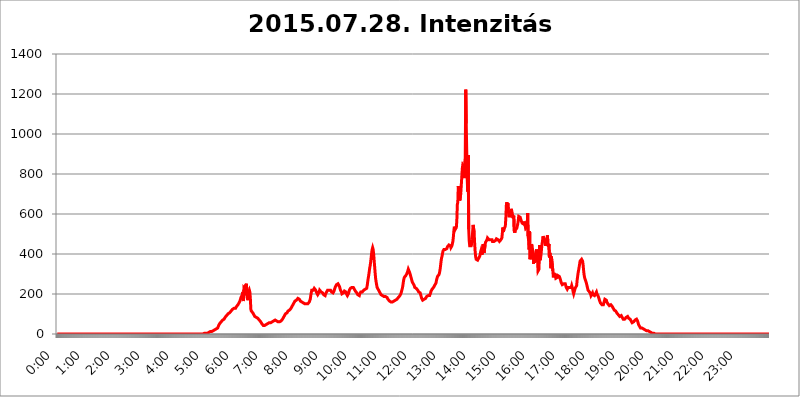
| Category | 2015.07.28. Intenzitás [W/m^2] |
|---|---|
| 0.0 | 0 |
| 0.0006944444444444445 | 0 |
| 0.001388888888888889 | 0 |
| 0.0020833333333333333 | 0 |
| 0.002777777777777778 | 0 |
| 0.003472222222222222 | 0 |
| 0.004166666666666667 | 0 |
| 0.004861111111111111 | 0 |
| 0.005555555555555556 | 0 |
| 0.0062499999999999995 | 0 |
| 0.006944444444444444 | 0 |
| 0.007638888888888889 | 0 |
| 0.008333333333333333 | 0 |
| 0.009027777777777779 | 0 |
| 0.009722222222222222 | 0 |
| 0.010416666666666666 | 0 |
| 0.011111111111111112 | 0 |
| 0.011805555555555555 | 0 |
| 0.012499999999999999 | 0 |
| 0.013194444444444444 | 0 |
| 0.013888888888888888 | 0 |
| 0.014583333333333332 | 0 |
| 0.015277777777777777 | 0 |
| 0.015972222222222224 | 0 |
| 0.016666666666666666 | 0 |
| 0.017361111111111112 | 0 |
| 0.018055555555555557 | 0 |
| 0.01875 | 0 |
| 0.019444444444444445 | 0 |
| 0.02013888888888889 | 0 |
| 0.020833333333333332 | 0 |
| 0.02152777777777778 | 0 |
| 0.022222222222222223 | 0 |
| 0.02291666666666667 | 0 |
| 0.02361111111111111 | 0 |
| 0.024305555555555556 | 0 |
| 0.024999999999999998 | 0 |
| 0.025694444444444447 | 0 |
| 0.02638888888888889 | 0 |
| 0.027083333333333334 | 0 |
| 0.027777777777777776 | 0 |
| 0.02847222222222222 | 0 |
| 0.029166666666666664 | 0 |
| 0.029861111111111113 | 0 |
| 0.030555555555555555 | 0 |
| 0.03125 | 0 |
| 0.03194444444444445 | 0 |
| 0.03263888888888889 | 0 |
| 0.03333333333333333 | 0 |
| 0.034027777777777775 | 0 |
| 0.034722222222222224 | 0 |
| 0.035416666666666666 | 0 |
| 0.036111111111111115 | 0 |
| 0.03680555555555556 | 0 |
| 0.0375 | 0 |
| 0.03819444444444444 | 0 |
| 0.03888888888888889 | 0 |
| 0.03958333333333333 | 0 |
| 0.04027777777777778 | 0 |
| 0.04097222222222222 | 0 |
| 0.041666666666666664 | 0 |
| 0.042361111111111106 | 0 |
| 0.04305555555555556 | 0 |
| 0.043750000000000004 | 0 |
| 0.044444444444444446 | 0 |
| 0.04513888888888889 | 0 |
| 0.04583333333333334 | 0 |
| 0.04652777777777778 | 0 |
| 0.04722222222222222 | 0 |
| 0.04791666666666666 | 0 |
| 0.04861111111111111 | 0 |
| 0.049305555555555554 | 0 |
| 0.049999999999999996 | 0 |
| 0.05069444444444445 | 0 |
| 0.051388888888888894 | 0 |
| 0.052083333333333336 | 0 |
| 0.05277777777777778 | 0 |
| 0.05347222222222222 | 0 |
| 0.05416666666666667 | 0 |
| 0.05486111111111111 | 0 |
| 0.05555555555555555 | 0 |
| 0.05625 | 0 |
| 0.05694444444444444 | 0 |
| 0.057638888888888885 | 0 |
| 0.05833333333333333 | 0 |
| 0.05902777777777778 | 0 |
| 0.059722222222222225 | 0 |
| 0.06041666666666667 | 0 |
| 0.061111111111111116 | 0 |
| 0.06180555555555556 | 0 |
| 0.0625 | 0 |
| 0.06319444444444444 | 0 |
| 0.06388888888888888 | 0 |
| 0.06458333333333334 | 0 |
| 0.06527777777777778 | 0 |
| 0.06597222222222222 | 0 |
| 0.06666666666666667 | 0 |
| 0.06736111111111111 | 0 |
| 0.06805555555555555 | 0 |
| 0.06874999999999999 | 0 |
| 0.06944444444444443 | 0 |
| 0.07013888888888889 | 0 |
| 0.07083333333333333 | 0 |
| 0.07152777777777779 | 0 |
| 0.07222222222222223 | 0 |
| 0.07291666666666667 | 0 |
| 0.07361111111111111 | 0 |
| 0.07430555555555556 | 0 |
| 0.075 | 0 |
| 0.07569444444444444 | 0 |
| 0.0763888888888889 | 0 |
| 0.07708333333333334 | 0 |
| 0.07777777777777778 | 0 |
| 0.07847222222222222 | 0 |
| 0.07916666666666666 | 0 |
| 0.0798611111111111 | 0 |
| 0.08055555555555556 | 0 |
| 0.08125 | 0 |
| 0.08194444444444444 | 0 |
| 0.08263888888888889 | 0 |
| 0.08333333333333333 | 0 |
| 0.08402777777777777 | 0 |
| 0.08472222222222221 | 0 |
| 0.08541666666666665 | 0 |
| 0.08611111111111112 | 0 |
| 0.08680555555555557 | 0 |
| 0.08750000000000001 | 0 |
| 0.08819444444444445 | 0 |
| 0.08888888888888889 | 0 |
| 0.08958333333333333 | 0 |
| 0.09027777777777778 | 0 |
| 0.09097222222222222 | 0 |
| 0.09166666666666667 | 0 |
| 0.09236111111111112 | 0 |
| 0.09305555555555556 | 0 |
| 0.09375 | 0 |
| 0.09444444444444444 | 0 |
| 0.09513888888888888 | 0 |
| 0.09583333333333333 | 0 |
| 0.09652777777777777 | 0 |
| 0.09722222222222222 | 0 |
| 0.09791666666666667 | 0 |
| 0.09861111111111111 | 0 |
| 0.09930555555555555 | 0 |
| 0.09999999999999999 | 0 |
| 0.10069444444444443 | 0 |
| 0.1013888888888889 | 0 |
| 0.10208333333333335 | 0 |
| 0.10277777777777779 | 0 |
| 0.10347222222222223 | 0 |
| 0.10416666666666667 | 0 |
| 0.10486111111111111 | 0 |
| 0.10555555555555556 | 0 |
| 0.10625 | 0 |
| 0.10694444444444444 | 0 |
| 0.1076388888888889 | 0 |
| 0.10833333333333334 | 0 |
| 0.10902777777777778 | 0 |
| 0.10972222222222222 | 0 |
| 0.1111111111111111 | 0 |
| 0.11180555555555556 | 0 |
| 0.11180555555555556 | 0 |
| 0.1125 | 0 |
| 0.11319444444444444 | 0 |
| 0.11388888888888889 | 0 |
| 0.11458333333333333 | 0 |
| 0.11527777777777777 | 0 |
| 0.11597222222222221 | 0 |
| 0.11666666666666665 | 0 |
| 0.1173611111111111 | 0 |
| 0.11805555555555557 | 0 |
| 0.11944444444444445 | 0 |
| 0.12013888888888889 | 0 |
| 0.12083333333333333 | 0 |
| 0.12152777777777778 | 0 |
| 0.12222222222222223 | 0 |
| 0.12291666666666667 | 0 |
| 0.12291666666666667 | 0 |
| 0.12361111111111112 | 0 |
| 0.12430555555555556 | 0 |
| 0.125 | 0 |
| 0.12569444444444444 | 0 |
| 0.12638888888888888 | 0 |
| 0.12708333333333333 | 0 |
| 0.16875 | 0 |
| 0.12847222222222224 | 0 |
| 0.12916666666666668 | 0 |
| 0.12986111111111112 | 0 |
| 0.13055555555555556 | 0 |
| 0.13125 | 0 |
| 0.13194444444444445 | 0 |
| 0.1326388888888889 | 0 |
| 0.13333333333333333 | 0 |
| 0.13402777777777777 | 0 |
| 0.13402777777777777 | 0 |
| 0.13472222222222222 | 0 |
| 0.13541666666666666 | 0 |
| 0.1361111111111111 | 0 |
| 0.13749999999999998 | 0 |
| 0.13819444444444443 | 0 |
| 0.1388888888888889 | 0 |
| 0.13958333333333334 | 0 |
| 0.14027777777777778 | 0 |
| 0.14097222222222222 | 0 |
| 0.14166666666666666 | 0 |
| 0.1423611111111111 | 0 |
| 0.14305555555555557 | 0 |
| 0.14375000000000002 | 0 |
| 0.14444444444444446 | 0 |
| 0.1451388888888889 | 0 |
| 0.1451388888888889 | 0 |
| 0.14652777777777778 | 0 |
| 0.14722222222222223 | 0 |
| 0.14791666666666667 | 0 |
| 0.1486111111111111 | 0 |
| 0.14930555555555555 | 0 |
| 0.15 | 0 |
| 0.15069444444444444 | 0 |
| 0.15138888888888888 | 0 |
| 0.15208333333333332 | 0 |
| 0.15277777777777776 | 0 |
| 0.15347222222222223 | 0 |
| 0.15416666666666667 | 0 |
| 0.15486111111111112 | 0 |
| 0.15555555555555556 | 0 |
| 0.15625 | 0 |
| 0.15694444444444444 | 0 |
| 0.15763888888888888 | 0 |
| 0.15833333333333333 | 0 |
| 0.15902777777777777 | 0 |
| 0.15972222222222224 | 0 |
| 0.16041666666666668 | 0 |
| 0.16111111111111112 | 0 |
| 0.16180555555555556 | 0 |
| 0.1625 | 0 |
| 0.16319444444444445 | 0 |
| 0.1638888888888889 | 0 |
| 0.16458333333333333 | 0 |
| 0.16527777777777777 | 0 |
| 0.16597222222222222 | 0 |
| 0.16666666666666666 | 0 |
| 0.1673611111111111 | 0 |
| 0.16805555555555554 | 0 |
| 0.16874999999999998 | 0 |
| 0.16944444444444443 | 0 |
| 0.17013888888888887 | 0 |
| 0.1708333333333333 | 0 |
| 0.17152777777777775 | 0 |
| 0.17222222222222225 | 0 |
| 0.1729166666666667 | 0 |
| 0.17361111111111113 | 0 |
| 0.17430555555555557 | 0 |
| 0.17500000000000002 | 0 |
| 0.17569444444444446 | 0 |
| 0.1763888888888889 | 0 |
| 0.17708333333333334 | 0 |
| 0.17777777777777778 | 0 |
| 0.17847222222222223 | 0 |
| 0.17916666666666667 | 0 |
| 0.1798611111111111 | 0 |
| 0.18055555555555555 | 0 |
| 0.18125 | 0 |
| 0.18194444444444444 | 0 |
| 0.1826388888888889 | 0 |
| 0.18333333333333335 | 0 |
| 0.1840277777777778 | 0 |
| 0.18472222222222223 | 0 |
| 0.18541666666666667 | 0 |
| 0.18611111111111112 | 0 |
| 0.18680555555555556 | 0 |
| 0.1875 | 0 |
| 0.18819444444444444 | 0 |
| 0.18888888888888888 | 0 |
| 0.18958333333333333 | 0 |
| 0.19027777777777777 | 0 |
| 0.1909722222222222 | 0 |
| 0.19166666666666665 | 0 |
| 0.19236111111111112 | 0 |
| 0.19305555555555554 | 0 |
| 0.19375 | 0 |
| 0.19444444444444445 | 0 |
| 0.1951388888888889 | 0 |
| 0.19583333333333333 | 0 |
| 0.19652777777777777 | 0 |
| 0.19722222222222222 | 0 |
| 0.19791666666666666 | 0 |
| 0.1986111111111111 | 0 |
| 0.19930555555555554 | 0 |
| 0.19999999999999998 | 0 |
| 0.20069444444444443 | 0 |
| 0.20138888888888887 | 0 |
| 0.2020833333333333 | 0 |
| 0.2027777777777778 | 0 |
| 0.2034722222222222 | 0 |
| 0.2041666666666667 | 0 |
| 0.20486111111111113 | 0 |
| 0.20555555555555557 | 0 |
| 0.20625000000000002 | 3.525 |
| 0.20694444444444446 | 3.525 |
| 0.2076388888888889 | 3.525 |
| 0.20833333333333334 | 3.525 |
| 0.20902777777777778 | 3.525 |
| 0.20972222222222223 | 3.525 |
| 0.21041666666666667 | 3.525 |
| 0.2111111111111111 | 7.887 |
| 0.21180555555555555 | 7.887 |
| 0.2125 | 7.887 |
| 0.21319444444444444 | 7.887 |
| 0.2138888888888889 | 7.887 |
| 0.21458333333333335 | 12.257 |
| 0.2152777777777778 | 12.257 |
| 0.21597222222222223 | 12.257 |
| 0.21666666666666667 | 12.257 |
| 0.21736111111111112 | 16.636 |
| 0.21805555555555556 | 16.636 |
| 0.21875 | 16.636 |
| 0.21944444444444444 | 21.024 |
| 0.22013888888888888 | 21.024 |
| 0.22083333333333333 | 21.024 |
| 0.22152777777777777 | 25.419 |
| 0.2222222222222222 | 25.419 |
| 0.22291666666666665 | 25.419 |
| 0.2236111111111111 | 29.823 |
| 0.22430555555555556 | 29.823 |
| 0.225 | 29.823 |
| 0.22569444444444445 | 34.234 |
| 0.2263888888888889 | 43.079 |
| 0.22708333333333333 | 47.511 |
| 0.22777777777777777 | 51.951 |
| 0.22847222222222222 | 51.951 |
| 0.22916666666666666 | 56.398 |
| 0.2298611111111111 | 60.85 |
| 0.23055555555555554 | 60.85 |
| 0.23124999999999998 | 65.31 |
| 0.23194444444444443 | 69.775 |
| 0.23263888888888887 | 69.775 |
| 0.2333333333333333 | 74.246 |
| 0.2340277777777778 | 74.246 |
| 0.2347222222222222 | 78.722 |
| 0.2354166666666667 | 83.205 |
| 0.23611111111111113 | 83.205 |
| 0.23680555555555557 | 87.692 |
| 0.23750000000000002 | 92.184 |
| 0.23819444444444446 | 92.184 |
| 0.2388888888888889 | 96.682 |
| 0.23958333333333334 | 101.184 |
| 0.24027777777777778 | 101.184 |
| 0.24097222222222223 | 105.69 |
| 0.24166666666666667 | 105.69 |
| 0.2423611111111111 | 110.201 |
| 0.24305555555555555 | 110.201 |
| 0.24375 | 114.716 |
| 0.24444444444444446 | 119.235 |
| 0.24513888888888888 | 119.235 |
| 0.24583333333333335 | 123.758 |
| 0.2465277777777778 | 123.758 |
| 0.24722222222222223 | 123.758 |
| 0.24791666666666667 | 128.284 |
| 0.24861111111111112 | 128.284 |
| 0.24930555555555556 | 128.284 |
| 0.25 | 128.284 |
| 0.25069444444444444 | 132.814 |
| 0.2513888888888889 | 137.347 |
| 0.2520833333333333 | 137.347 |
| 0.25277777777777777 | 141.884 |
| 0.2534722222222222 | 146.423 |
| 0.25416666666666665 | 150.964 |
| 0.2548611111111111 | 155.509 |
| 0.2555555555555556 | 160.056 |
| 0.25625000000000003 | 164.605 |
| 0.2569444444444445 | 173.709 |
| 0.2576388888888889 | 182.82 |
| 0.25833333333333336 | 187.378 |
| 0.2590277777777778 | 191.937 |
| 0.25972222222222224 | 201.058 |
| 0.2604166666666667 | 210.182 |
| 0.2611111111111111 | 164.605 |
| 0.26180555555555557 | 223.873 |
| 0.2625 | 228.436 |
| 0.26319444444444445 | 214.746 |
| 0.2638888888888889 | 246.689 |
| 0.26458333333333334 | 233 |
| 0.2652777777777778 | 251.251 |
| 0.2659722222222222 | 246.689 |
| 0.26666666666666666 | 178.264 |
| 0.2673611111111111 | 169.156 |
| 0.26805555555555555 | 205.62 |
| 0.26875 | 205.62 |
| 0.26944444444444443 | 219.309 |
| 0.2701388888888889 | 210.182 |
| 0.2708333333333333 | 178.264 |
| 0.27152777777777776 | 123.758 |
| 0.2722222222222222 | 114.716 |
| 0.27291666666666664 | 114.716 |
| 0.2736111111111111 | 110.201 |
| 0.2743055555555555 | 105.69 |
| 0.27499999999999997 | 101.184 |
| 0.27569444444444446 | 96.682 |
| 0.27638888888888885 | 92.184 |
| 0.27708333333333335 | 87.692 |
| 0.2777777777777778 | 83.205 |
| 0.27847222222222223 | 83.205 |
| 0.2791666666666667 | 83.205 |
| 0.2798611111111111 | 78.722 |
| 0.28055555555555556 | 78.722 |
| 0.28125 | 78.722 |
| 0.28194444444444444 | 74.246 |
| 0.2826388888888889 | 74.246 |
| 0.2833333333333333 | 69.775 |
| 0.28402777777777777 | 65.31 |
| 0.2847222222222222 | 65.31 |
| 0.28541666666666665 | 60.85 |
| 0.28611111111111115 | 56.398 |
| 0.28680555555555554 | 51.951 |
| 0.28750000000000003 | 47.511 |
| 0.2881944444444445 | 47.511 |
| 0.2888888888888889 | 43.079 |
| 0.28958333333333336 | 43.079 |
| 0.2902777777777778 | 43.079 |
| 0.29097222222222224 | 43.079 |
| 0.2916666666666667 | 43.079 |
| 0.2923611111111111 | 47.511 |
| 0.29305555555555557 | 47.511 |
| 0.29375 | 47.511 |
| 0.29444444444444445 | 47.511 |
| 0.2951388888888889 | 51.951 |
| 0.29583333333333334 | 51.951 |
| 0.2965277777777778 | 56.398 |
| 0.2972222222222222 | 56.398 |
| 0.29791666666666666 | 56.398 |
| 0.2986111111111111 | 56.398 |
| 0.29930555555555555 | 56.398 |
| 0.3 | 56.398 |
| 0.30069444444444443 | 60.85 |
| 0.3013888888888889 | 60.85 |
| 0.3020833333333333 | 60.85 |
| 0.30277777777777776 | 65.31 |
| 0.3034722222222222 | 65.31 |
| 0.30416666666666664 | 65.31 |
| 0.3048611111111111 | 69.775 |
| 0.3055555555555555 | 69.775 |
| 0.30624999999999997 | 69.775 |
| 0.3069444444444444 | 69.775 |
| 0.3076388888888889 | 65.31 |
| 0.30833333333333335 | 65.31 |
| 0.3090277777777778 | 60.85 |
| 0.30972222222222223 | 60.85 |
| 0.3104166666666667 | 56.398 |
| 0.3111111111111111 | 56.398 |
| 0.31180555555555556 | 60.85 |
| 0.3125 | 60.85 |
| 0.31319444444444444 | 60.85 |
| 0.3138888888888889 | 65.31 |
| 0.3145833333333333 | 65.31 |
| 0.31527777777777777 | 69.775 |
| 0.3159722222222222 | 74.246 |
| 0.31666666666666665 | 74.246 |
| 0.31736111111111115 | 83.205 |
| 0.31805555555555554 | 87.692 |
| 0.31875000000000003 | 92.184 |
| 0.3194444444444445 | 96.682 |
| 0.3201388888888889 | 101.184 |
| 0.32083333333333336 | 105.69 |
| 0.3215277777777778 | 105.69 |
| 0.32222222222222224 | 105.69 |
| 0.3229166666666667 | 110.201 |
| 0.3236111111111111 | 114.716 |
| 0.32430555555555557 | 119.235 |
| 0.325 | 119.235 |
| 0.32569444444444445 | 119.235 |
| 0.3263888888888889 | 119.235 |
| 0.32708333333333334 | 123.758 |
| 0.3277777777777778 | 128.284 |
| 0.3284722222222222 | 132.814 |
| 0.32916666666666666 | 137.347 |
| 0.3298611111111111 | 141.884 |
| 0.33055555555555555 | 146.423 |
| 0.33125 | 150.964 |
| 0.33194444444444443 | 155.509 |
| 0.3326388888888889 | 160.056 |
| 0.3333333333333333 | 164.605 |
| 0.3340277777777778 | 169.156 |
| 0.3347222222222222 | 169.156 |
| 0.3354166666666667 | 169.156 |
| 0.3361111111111111 | 173.709 |
| 0.3368055555555556 | 173.709 |
| 0.33749999999999997 | 178.264 |
| 0.33819444444444446 | 178.264 |
| 0.33888888888888885 | 178.264 |
| 0.33958333333333335 | 173.709 |
| 0.34027777777777773 | 173.709 |
| 0.34097222222222223 | 164.605 |
| 0.3416666666666666 | 164.605 |
| 0.3423611111111111 | 164.605 |
| 0.3430555555555555 | 160.056 |
| 0.34375 | 160.056 |
| 0.3444444444444445 | 160.056 |
| 0.3451388888888889 | 155.509 |
| 0.3458333333333334 | 155.509 |
| 0.34652777777777777 | 155.509 |
| 0.34722222222222227 | 150.964 |
| 0.34791666666666665 | 150.964 |
| 0.34861111111111115 | 150.964 |
| 0.34930555555555554 | 150.964 |
| 0.35000000000000003 | 150.964 |
| 0.3506944444444444 | 150.964 |
| 0.3513888888888889 | 150.964 |
| 0.3520833333333333 | 155.509 |
| 0.3527777777777778 | 155.509 |
| 0.3534722222222222 | 160.056 |
| 0.3541666666666667 | 164.605 |
| 0.3548611111111111 | 173.709 |
| 0.35555555555555557 | 191.937 |
| 0.35625 | 205.62 |
| 0.35694444444444445 | 219.309 |
| 0.3576388888888889 | 223.873 |
| 0.35833333333333334 | 223.873 |
| 0.3590277777777778 | 219.309 |
| 0.3597222222222222 | 223.873 |
| 0.36041666666666666 | 228.436 |
| 0.3611111111111111 | 228.436 |
| 0.36180555555555555 | 228.436 |
| 0.3625 | 219.309 |
| 0.36319444444444443 | 214.746 |
| 0.3638888888888889 | 205.62 |
| 0.3645833333333333 | 201.058 |
| 0.3652777777777778 | 196.497 |
| 0.3659722222222222 | 196.497 |
| 0.3666666666666667 | 201.058 |
| 0.3673611111111111 | 210.182 |
| 0.3680555555555556 | 219.309 |
| 0.36874999999999997 | 219.309 |
| 0.36944444444444446 | 219.309 |
| 0.37013888888888885 | 210.182 |
| 0.37083333333333335 | 210.182 |
| 0.37152777777777773 | 205.62 |
| 0.37222222222222223 | 205.62 |
| 0.3729166666666666 | 201.058 |
| 0.3736111111111111 | 196.497 |
| 0.3743055555555555 | 196.497 |
| 0.375 | 191.937 |
| 0.3756944444444445 | 191.937 |
| 0.3763888888888889 | 201.058 |
| 0.3770833333333334 | 205.62 |
| 0.37777777777777777 | 210.182 |
| 0.37847222222222227 | 214.746 |
| 0.37916666666666665 | 219.309 |
| 0.37986111111111115 | 219.309 |
| 0.38055555555555554 | 219.309 |
| 0.38125000000000003 | 219.309 |
| 0.3819444444444444 | 219.309 |
| 0.3826388888888889 | 223.873 |
| 0.3833333333333333 | 219.309 |
| 0.3840277777777778 | 214.746 |
| 0.3847222222222222 | 210.182 |
| 0.3854166666666667 | 210.182 |
| 0.3861111111111111 | 210.182 |
| 0.38680555555555557 | 205.62 |
| 0.3875 | 205.62 |
| 0.38819444444444445 | 214.746 |
| 0.3888888888888889 | 223.873 |
| 0.38958333333333334 | 228.436 |
| 0.3902777777777778 | 237.564 |
| 0.3909722222222222 | 242.127 |
| 0.39166666666666666 | 246.689 |
| 0.3923611111111111 | 251.251 |
| 0.39305555555555555 | 246.689 |
| 0.39375 | 251.251 |
| 0.39444444444444443 | 251.251 |
| 0.3951388888888889 | 251.251 |
| 0.3958333333333333 | 237.564 |
| 0.3965277777777778 | 228.436 |
| 0.3972222222222222 | 219.309 |
| 0.3979166666666667 | 214.746 |
| 0.3986111111111111 | 210.182 |
| 0.3993055555555556 | 201.058 |
| 0.39999999999999997 | 196.497 |
| 0.40069444444444446 | 201.058 |
| 0.40138888888888885 | 205.62 |
| 0.40208333333333335 | 210.182 |
| 0.40277777777777773 | 214.746 |
| 0.40347222222222223 | 214.746 |
| 0.4041666666666666 | 210.182 |
| 0.4048611111111111 | 210.182 |
| 0.4055555555555555 | 201.058 |
| 0.40625 | 196.497 |
| 0.4069444444444445 | 191.937 |
| 0.4076388888888889 | 191.937 |
| 0.4083333333333334 | 201.058 |
| 0.40902777777777777 | 210.182 |
| 0.40972222222222227 | 219.309 |
| 0.41041666666666665 | 223.873 |
| 0.41111111111111115 | 228.436 |
| 0.41180555555555554 | 233 |
| 0.41250000000000003 | 233 |
| 0.4131944444444444 | 233 |
| 0.4138888888888889 | 233 |
| 0.4145833333333333 | 233 |
| 0.4152777777777778 | 233 |
| 0.4159722222222222 | 228.436 |
| 0.4166666666666667 | 223.873 |
| 0.4173611111111111 | 219.309 |
| 0.41805555555555557 | 214.746 |
| 0.41875 | 210.182 |
| 0.41944444444444445 | 210.182 |
| 0.4201388888888889 | 205.62 |
| 0.42083333333333334 | 201.058 |
| 0.4215277777777778 | 196.497 |
| 0.4222222222222222 | 191.937 |
| 0.42291666666666666 | 191.937 |
| 0.4236111111111111 | 191.937 |
| 0.42430555555555555 | 201.058 |
| 0.425 | 205.62 |
| 0.42569444444444443 | 210.182 |
| 0.4263888888888889 | 210.182 |
| 0.4270833333333333 | 210.182 |
| 0.4277777777777778 | 210.182 |
| 0.4284722222222222 | 210.182 |
| 0.4291666666666667 | 214.746 |
| 0.4298611111111111 | 219.309 |
| 0.4305555555555556 | 223.873 |
| 0.43124999999999997 | 223.873 |
| 0.43194444444444446 | 223.873 |
| 0.43263888888888885 | 219.309 |
| 0.43333333333333335 | 223.873 |
| 0.43402777777777773 | 228.436 |
| 0.43472222222222223 | 242.127 |
| 0.4354166666666666 | 260.373 |
| 0.4361111111111111 | 278.603 |
| 0.4368055555555555 | 292.259 |
| 0.4375 | 310.44 |
| 0.4381944444444445 | 328.584 |
| 0.4388888888888889 | 342.162 |
| 0.4395833333333334 | 360.221 |
| 0.44027777777777777 | 382.715 |
| 0.44097222222222227 | 405.108 |
| 0.44166666666666665 | 422.943 |
| 0.44236111111111115 | 431.833 |
| 0.44305555555555554 | 422.943 |
| 0.44375000000000003 | 400.638 |
| 0.4444444444444444 | 369.23 |
| 0.4451388888888889 | 337.639 |
| 0.4458333333333333 | 305.898 |
| 0.4465277777777778 | 278.603 |
| 0.4472222222222222 | 260.373 |
| 0.4479166666666667 | 246.689 |
| 0.4486111111111111 | 233 |
| 0.44930555555555557 | 228.436 |
| 0.45 | 223.873 |
| 0.45069444444444445 | 219.309 |
| 0.4513888888888889 | 214.746 |
| 0.45208333333333334 | 210.182 |
| 0.4527777777777778 | 205.62 |
| 0.4534722222222222 | 201.058 |
| 0.45416666666666666 | 196.497 |
| 0.4548611111111111 | 191.937 |
| 0.45555555555555555 | 191.937 |
| 0.45625 | 191.937 |
| 0.45694444444444443 | 191.937 |
| 0.4576388888888889 | 191.937 |
| 0.4583333333333333 | 187.378 |
| 0.4590277777777778 | 187.378 |
| 0.4597222222222222 | 182.82 |
| 0.4604166666666667 | 187.378 |
| 0.4611111111111111 | 182.82 |
| 0.4618055555555556 | 182.82 |
| 0.46249999999999997 | 182.82 |
| 0.46319444444444446 | 182.82 |
| 0.46388888888888885 | 173.709 |
| 0.46458333333333335 | 173.709 |
| 0.46527777777777773 | 169.156 |
| 0.46597222222222223 | 164.605 |
| 0.4666666666666666 | 164.605 |
| 0.4673611111111111 | 160.056 |
| 0.4680555555555555 | 160.056 |
| 0.46875 | 164.605 |
| 0.4694444444444445 | 160.056 |
| 0.4701388888888889 | 160.056 |
| 0.4708333333333334 | 160.056 |
| 0.47152777777777777 | 164.605 |
| 0.47222222222222227 | 164.605 |
| 0.47291666666666665 | 164.605 |
| 0.47361111111111115 | 164.605 |
| 0.47430555555555554 | 169.156 |
| 0.47500000000000003 | 169.156 |
| 0.4756944444444444 | 169.156 |
| 0.4763888888888889 | 173.709 |
| 0.4770833333333333 | 173.709 |
| 0.4777777777777778 | 178.264 |
| 0.4784722222222222 | 182.82 |
| 0.4791666666666667 | 182.82 |
| 0.4798611111111111 | 187.378 |
| 0.48055555555555557 | 191.937 |
| 0.48125 | 196.497 |
| 0.48194444444444445 | 201.058 |
| 0.4826388888888889 | 210.182 |
| 0.48333333333333334 | 219.309 |
| 0.4840277777777778 | 228.436 |
| 0.4847222222222222 | 242.127 |
| 0.48541666666666666 | 260.373 |
| 0.4861111111111111 | 274.047 |
| 0.48680555555555555 | 283.156 |
| 0.4875 | 287.709 |
| 0.48819444444444443 | 287.709 |
| 0.4888888888888889 | 292.259 |
| 0.4895833333333333 | 296.808 |
| 0.4902777777777778 | 301.354 |
| 0.4909722222222222 | 305.898 |
| 0.4916666666666667 | 314.98 |
| 0.4923611111111111 | 324.052 |
| 0.4930555555555556 | 324.052 |
| 0.49374999999999997 | 319.517 |
| 0.49444444444444446 | 305.898 |
| 0.49513888888888885 | 296.808 |
| 0.49583333333333335 | 287.709 |
| 0.49652777777777773 | 278.603 |
| 0.49722222222222223 | 269.49 |
| 0.4979166666666666 | 260.373 |
| 0.4986111111111111 | 255.813 |
| 0.4993055555555555 | 251.251 |
| 0.5 | 251.251 |
| 0.5006944444444444 | 242.127 |
| 0.5013888888888889 | 233 |
| 0.5020833333333333 | 233 |
| 0.5027777777777778 | 233 |
| 0.5034722222222222 | 228.436 |
| 0.5041666666666667 | 228.436 |
| 0.5048611111111111 | 223.873 |
| 0.5055555555555555 | 219.309 |
| 0.50625 | 214.746 |
| 0.5069444444444444 | 210.182 |
| 0.5076388888888889 | 205.62 |
| 0.5083333333333333 | 205.62 |
| 0.5090277777777777 | 205.62 |
| 0.5097222222222222 | 196.497 |
| 0.5104166666666666 | 187.378 |
| 0.5111111111111112 | 178.264 |
| 0.5118055555555555 | 173.709 |
| 0.5125000000000001 | 169.156 |
| 0.5131944444444444 | 169.156 |
| 0.513888888888889 | 169.156 |
| 0.5145833333333333 | 173.709 |
| 0.5152777777777778 | 173.709 |
| 0.5159722222222222 | 173.709 |
| 0.5166666666666667 | 178.264 |
| 0.517361111111111 | 182.82 |
| 0.5180555555555556 | 187.378 |
| 0.5187499999999999 | 191.937 |
| 0.5194444444444445 | 191.937 |
| 0.5201388888888888 | 191.937 |
| 0.5208333333333334 | 191.937 |
| 0.5215277777777778 | 191.937 |
| 0.5222222222222223 | 191.937 |
| 0.5229166666666667 | 196.497 |
| 0.5236111111111111 | 205.62 |
| 0.5243055555555556 | 214.746 |
| 0.525 | 219.309 |
| 0.5256944444444445 | 223.873 |
| 0.5263888888888889 | 223.873 |
| 0.5270833333333333 | 228.436 |
| 0.5277777777777778 | 233 |
| 0.5284722222222222 | 237.564 |
| 0.5291666666666667 | 242.127 |
| 0.5298611111111111 | 242.127 |
| 0.5305555555555556 | 246.689 |
| 0.53125 | 255.813 |
| 0.5319444444444444 | 269.49 |
| 0.5326388888888889 | 278.603 |
| 0.5333333333333333 | 287.709 |
| 0.5340277777777778 | 292.259 |
| 0.5347222222222222 | 292.259 |
| 0.5354166666666667 | 296.808 |
| 0.5361111111111111 | 305.898 |
| 0.5368055555555555 | 319.517 |
| 0.5375 | 337.639 |
| 0.5381944444444444 | 360.221 |
| 0.5388888888888889 | 378.224 |
| 0.5395833333333333 | 387.202 |
| 0.5402777777777777 | 400.638 |
| 0.5409722222222222 | 414.035 |
| 0.5416666666666666 | 418.492 |
| 0.5423611111111112 | 422.943 |
| 0.5430555555555555 | 427.39 |
| 0.5437500000000001 | 427.39 |
| 0.5444444444444444 | 422.943 |
| 0.545138888888889 | 418.492 |
| 0.5458333333333333 | 418.492 |
| 0.5465277777777778 | 427.39 |
| 0.5472222222222222 | 436.27 |
| 0.5479166666666667 | 440.702 |
| 0.548611111111111 | 440.702 |
| 0.5493055555555556 | 445.129 |
| 0.5499999999999999 | 449.551 |
| 0.5506944444444445 | 445.129 |
| 0.5513888888888888 | 440.702 |
| 0.5520833333333334 | 431.833 |
| 0.5527777777777778 | 431.833 |
| 0.5534722222222223 | 440.702 |
| 0.5541666666666667 | 445.129 |
| 0.5548611111111111 | 462.786 |
| 0.5555555555555556 | 484.735 |
| 0.55625 | 515.223 |
| 0.5569444444444445 | 536.82 |
| 0.5576388888888889 | 532.513 |
| 0.5583333333333333 | 523.88 |
| 0.5590277777777778 | 519.555 |
| 0.5597222222222222 | 532.513 |
| 0.5604166666666667 | 566.793 |
| 0.5611111111111111 | 646.537 |
| 0.5618055555555556 | 658.909 |
| 0.5625 | 739.877 |
| 0.5631944444444444 | 743.859 |
| 0.5638888888888889 | 699.717 |
| 0.5645833333333333 | 667.123 |
| 0.5652777777777778 | 667.123 |
| 0.5659722222222222 | 703.762 |
| 0.5666666666666667 | 743.859 |
| 0.5673611111111111 | 783.342 |
| 0.5680555555555555 | 826.123 |
| 0.56875 | 845.365 |
| 0.5694444444444444 | 845.365 |
| 0.5701388888888889 | 837.682 |
| 0.5708333333333333 | 779.42 |
| 0.5715277777777777 | 783.342 |
| 0.5722222222222222 | 875.918 |
| 0.5729166666666666 | 1221.83 |
| 0.5736111111111112 | 1052.255 |
| 0.5743055555555555 | 917.534 |
| 0.5750000000000001 | 775.492 |
| 0.5756944444444444 | 711.832 |
| 0.576388888888889 | 894.885 |
| 0.5770833333333333 | 523.88 |
| 0.5777777777777778 | 467.187 |
| 0.5784722222222222 | 440.702 |
| 0.5791666666666667 | 436.27 |
| 0.579861111111111 | 436.27 |
| 0.5805555555555556 | 440.702 |
| 0.5812499999999999 | 449.551 |
| 0.5819444444444445 | 471.582 |
| 0.5826388888888888 | 515.223 |
| 0.5833333333333334 | 545.416 |
| 0.5840277777777778 | 545.416 |
| 0.5847222222222223 | 506.542 |
| 0.5854166666666667 | 453.968 |
| 0.5861111111111111 | 414.035 |
| 0.5868055555555556 | 387.202 |
| 0.5875 | 373.729 |
| 0.5881944444444445 | 369.23 |
| 0.5888888888888889 | 369.23 |
| 0.5895833333333333 | 369.23 |
| 0.5902777777777778 | 373.729 |
| 0.5909722222222222 | 378.224 |
| 0.5916666666666667 | 378.224 |
| 0.5923611111111111 | 387.202 |
| 0.5930555555555556 | 396.164 |
| 0.59375 | 409.574 |
| 0.5944444444444444 | 418.492 |
| 0.5951388888888889 | 409.574 |
| 0.5958333333333333 | 396.164 |
| 0.5965277777777778 | 431.833 |
| 0.5972222222222222 | 449.551 |
| 0.5979166666666667 | 440.702 |
| 0.5986111111111111 | 405.108 |
| 0.5993055555555555 | 409.574 |
| 0.6 | 445.129 |
| 0.6006944444444444 | 458.38 |
| 0.6013888888888889 | 462.786 |
| 0.6020833333333333 | 462.786 |
| 0.6027777777777777 | 471.582 |
| 0.6034722222222222 | 480.356 |
| 0.6041666666666666 | 484.735 |
| 0.6048611111111112 | 480.356 |
| 0.6055555555555555 | 471.582 |
| 0.6062500000000001 | 467.187 |
| 0.6069444444444444 | 467.187 |
| 0.607638888888889 | 471.582 |
| 0.6083333333333333 | 475.972 |
| 0.6090277777777778 | 475.972 |
| 0.6097222222222222 | 471.582 |
| 0.6104166666666667 | 462.786 |
| 0.611111111111111 | 458.38 |
| 0.6118055555555556 | 458.38 |
| 0.6124999999999999 | 462.786 |
| 0.6131944444444445 | 462.786 |
| 0.6138888888888888 | 462.786 |
| 0.6145833333333334 | 467.187 |
| 0.6152777777777778 | 471.582 |
| 0.6159722222222223 | 475.972 |
| 0.6166666666666667 | 480.356 |
| 0.6173611111111111 | 475.972 |
| 0.6180555555555556 | 471.582 |
| 0.61875 | 467.187 |
| 0.6194444444444445 | 467.187 |
| 0.6201388888888889 | 462.786 |
| 0.6208333333333333 | 458.38 |
| 0.6215277777777778 | 462.786 |
| 0.6222222222222222 | 471.582 |
| 0.6229166666666667 | 475.972 |
| 0.6236111111111111 | 480.356 |
| 0.6243055555555556 | 480.356 |
| 0.625 | 532.513 |
| 0.6256944444444444 | 510.885 |
| 0.6263888888888889 | 519.555 |
| 0.6270833333333333 | 519.555 |
| 0.6277777777777778 | 515.223 |
| 0.6284722222222222 | 541.121 |
| 0.6291666666666667 | 579.542 |
| 0.6298611111111111 | 642.4 |
| 0.6305555555555555 | 658.909 |
| 0.63125 | 642.4 |
| 0.6319444444444444 | 654.791 |
| 0.6326388888888889 | 621.613 |
| 0.6333333333333333 | 592.233 |
| 0.6340277777777777 | 583.779 |
| 0.6347222222222222 | 596.45 |
| 0.6354166666666666 | 600.661 |
| 0.6361111111111112 | 613.252 |
| 0.6368055555555555 | 625.784 |
| 0.6375000000000001 | 613.252 |
| 0.6381944444444444 | 604.864 |
| 0.638888888888889 | 579.542 |
| 0.6395833333333333 | 575.299 |
| 0.6402777777777778 | 592.233 |
| 0.6409722222222222 | 515.223 |
| 0.6416666666666667 | 506.542 |
| 0.642361111111111 | 519.555 |
| 0.6430555555555556 | 515.223 |
| 0.6437499999999999 | 523.88 |
| 0.6444444444444445 | 528.2 |
| 0.6451388888888888 | 532.513 |
| 0.6458333333333334 | 549.704 |
| 0.6465277777777778 | 566.793 |
| 0.6472222222222223 | 588.009 |
| 0.6479166666666667 | 592.233 |
| 0.6486111111111111 | 592.233 |
| 0.6493055555555556 | 583.779 |
| 0.65 | 575.299 |
| 0.6506944444444445 | 566.793 |
| 0.6513888888888889 | 566.793 |
| 0.6520833333333333 | 553.986 |
| 0.6527777777777778 | 549.704 |
| 0.6534722222222222 | 549.704 |
| 0.6541666666666667 | 549.704 |
| 0.6548611111111111 | 562.53 |
| 0.6555555555555556 | 549.704 |
| 0.65625 | 541.121 |
| 0.6569444444444444 | 528.2 |
| 0.6576388888888889 | 528.2 |
| 0.6583333333333333 | 523.88 |
| 0.6590277777777778 | 536.82 |
| 0.6597222222222222 | 604.864 |
| 0.6604166666666667 | 489.108 |
| 0.6611111111111111 | 467.187 |
| 0.6618055555555555 | 422.943 |
| 0.6625 | 515.223 |
| 0.6631944444444444 | 373.729 |
| 0.6638888888888889 | 387.202 |
| 0.6645833333333333 | 396.164 |
| 0.6652777777777777 | 449.551 |
| 0.6659722222222222 | 436.27 |
| 0.6666666666666666 | 422.943 |
| 0.6673611111111111 | 405.108 |
| 0.6680555555555556 | 351.198 |
| 0.6687500000000001 | 382.715 |
| 0.6694444444444444 | 355.712 |
| 0.6701388888888888 | 369.23 |
| 0.6708333333333334 | 400.638 |
| 0.6715277777777778 | 396.164 |
| 0.6722222222222222 | 422.943 |
| 0.6729166666666666 | 427.39 |
| 0.6736111111111112 | 369.23 |
| 0.6743055555555556 | 314.98 |
| 0.6749999999999999 | 310.44 |
| 0.6756944444444444 | 324.052 |
| 0.6763888888888889 | 445.129 |
| 0.6770833333333334 | 369.23 |
| 0.6777777777777777 | 378.224 |
| 0.6784722222222223 | 396.164 |
| 0.6791666666666667 | 422.943 |
| 0.6798611111111111 | 449.551 |
| 0.6805555555555555 | 462.786 |
| 0.68125 | 489.108 |
| 0.6819444444444445 | 489.108 |
| 0.6826388888888889 | 493.475 |
| 0.6833333333333332 | 471.582 |
| 0.6840277777777778 | 453.968 |
| 0.6847222222222222 | 440.702 |
| 0.6854166666666667 | 440.702 |
| 0.686111111111111 | 462.786 |
| 0.6868055555555556 | 467.187 |
| 0.6875 | 493.475 |
| 0.6881944444444444 | 449.551 |
| 0.688888888888889 | 436.27 |
| 0.6895833333333333 | 449.551 |
| 0.6902777777777778 | 382.715 |
| 0.6909722222222222 | 405.108 |
| 0.6916666666666668 | 382.715 |
| 0.6923611111111111 | 328.584 |
| 0.6930555555555555 | 387.202 |
| 0.69375 | 387.202 |
| 0.6944444444444445 | 382.715 |
| 0.6951388888888889 | 314.98 |
| 0.6958333333333333 | 283.156 |
| 0.6965277777777777 | 305.898 |
| 0.6972222222222223 | 287.709 |
| 0.6979166666666666 | 301.354 |
| 0.6986111111111111 | 292.259 |
| 0.6993055555555556 | 278.603 |
| 0.7000000000000001 | 274.047 |
| 0.7006944444444444 | 278.603 |
| 0.7013888888888888 | 283.156 |
| 0.7020833333333334 | 292.259 |
| 0.7027777777777778 | 296.808 |
| 0.7034722222222222 | 296.808 |
| 0.7041666666666666 | 287.709 |
| 0.7048611111111112 | 283.156 |
| 0.7055555555555556 | 274.047 |
| 0.7062499999999999 | 264.932 |
| 0.7069444444444444 | 255.813 |
| 0.7076388888888889 | 251.251 |
| 0.7083333333333334 | 246.689 |
| 0.7090277777777777 | 251.251 |
| 0.7097222222222223 | 251.251 |
| 0.7104166666666667 | 251.251 |
| 0.7111111111111111 | 251.251 |
| 0.7118055555555555 | 251.251 |
| 0.7125 | 251.251 |
| 0.7131944444444445 | 242.127 |
| 0.7138888888888889 | 233 |
| 0.7145833333333332 | 228.436 |
| 0.7152777777777778 | 223.873 |
| 0.7159722222222222 | 228.436 |
| 0.7166666666666667 | 233 |
| 0.717361111111111 | 233 |
| 0.7180555555555556 | 228.436 |
| 0.71875 | 233 |
| 0.7194444444444444 | 237.564 |
| 0.720138888888889 | 233 |
| 0.7208333333333333 | 233 |
| 0.7215277777777778 | 242.127 |
| 0.7222222222222222 | 237.564 |
| 0.7229166666666668 | 223.873 |
| 0.7236111111111111 | 210.182 |
| 0.7243055555555555 | 201.058 |
| 0.725 | 210.182 |
| 0.7256944444444445 | 219.309 |
| 0.7263888888888889 | 228.436 |
| 0.7270833333333333 | 228.436 |
| 0.7277777777777777 | 228.436 |
| 0.7284722222222223 | 242.127 |
| 0.7291666666666666 | 269.49 |
| 0.7298611111111111 | 287.709 |
| 0.7305555555555556 | 305.898 |
| 0.7312500000000001 | 319.517 |
| 0.7319444444444444 | 324.052 |
| 0.7326388888888888 | 324.052 |
| 0.7333333333333334 | 364.728 |
| 0.7340277777777778 | 369.23 |
| 0.7347222222222222 | 364.728 |
| 0.7354166666666666 | 373.729 |
| 0.7361111111111112 | 373.729 |
| 0.7368055555555556 | 364.728 |
| 0.7374999999999999 | 346.682 |
| 0.7381944444444444 | 319.517 |
| 0.7388888888888889 | 296.808 |
| 0.7395833333333334 | 283.156 |
| 0.7402777777777777 | 274.047 |
| 0.7409722222222223 | 269.49 |
| 0.7416666666666667 | 260.373 |
| 0.7423611111111111 | 251.251 |
| 0.7430555555555555 | 251.251 |
| 0.74375 | 246.689 |
| 0.7444444444444445 | 219.309 |
| 0.7451388888888889 | 214.746 |
| 0.7458333333333332 | 214.746 |
| 0.7465277777777778 | 210.182 |
| 0.7472222222222222 | 210.182 |
| 0.7479166666666667 | 201.058 |
| 0.748611111111111 | 191.937 |
| 0.7493055555555556 | 187.378 |
| 0.75 | 187.378 |
| 0.7506944444444444 | 205.62 |
| 0.751388888888889 | 196.497 |
| 0.7520833333333333 | 191.937 |
| 0.7527777777777778 | 191.937 |
| 0.7534722222222222 | 191.937 |
| 0.7541666666666668 | 191.937 |
| 0.7548611111111111 | 201.058 |
| 0.7555555555555555 | 205.62 |
| 0.75625 | 210.182 |
| 0.7569444444444445 | 201.058 |
| 0.7576388888888889 | 201.058 |
| 0.7583333333333333 | 191.937 |
| 0.7590277777777777 | 191.937 |
| 0.7597222222222223 | 178.264 |
| 0.7604166666666666 | 169.156 |
| 0.7611111111111111 | 164.605 |
| 0.7618055555555556 | 155.509 |
| 0.7625000000000001 | 155.509 |
| 0.7631944444444444 | 150.964 |
| 0.7638888888888888 | 146.423 |
| 0.7645833333333334 | 146.423 |
| 0.7652777777777778 | 146.423 |
| 0.7659722222222222 | 146.423 |
| 0.7666666666666666 | 155.509 |
| 0.7673611111111112 | 164.605 |
| 0.7680555555555556 | 173.709 |
| 0.7687499999999999 | 173.709 |
| 0.7694444444444444 | 173.709 |
| 0.7701388888888889 | 169.156 |
| 0.7708333333333334 | 160.056 |
| 0.7715277777777777 | 155.509 |
| 0.7722222222222223 | 150.964 |
| 0.7729166666666667 | 146.423 |
| 0.7736111111111111 | 146.423 |
| 0.7743055555555555 | 141.884 |
| 0.775 | 141.884 |
| 0.7756944444444445 | 141.884 |
| 0.7763888888888889 | 146.423 |
| 0.7770833333333332 | 146.423 |
| 0.7777777777777778 | 141.884 |
| 0.7784722222222222 | 137.347 |
| 0.7791666666666667 | 132.814 |
| 0.779861111111111 | 128.284 |
| 0.7805555555555556 | 123.758 |
| 0.78125 | 119.235 |
| 0.7819444444444444 | 119.235 |
| 0.782638888888889 | 119.235 |
| 0.7833333333333333 | 114.716 |
| 0.7840277777777778 | 110.201 |
| 0.7847222222222222 | 105.69 |
| 0.7854166666666668 | 105.69 |
| 0.7861111111111111 | 101.184 |
| 0.7868055555555555 | 96.682 |
| 0.7875 | 92.184 |
| 0.7881944444444445 | 92.184 |
| 0.7888888888888889 | 87.692 |
| 0.7895833333333333 | 92.184 |
| 0.7902777777777777 | 92.184 |
| 0.7909722222222223 | 92.184 |
| 0.7916666666666666 | 92.184 |
| 0.7923611111111111 | 83.205 |
| 0.7930555555555556 | 78.722 |
| 0.7937500000000001 | 74.246 |
| 0.7944444444444444 | 74.246 |
| 0.7951388888888888 | 74.246 |
| 0.7958333333333334 | 74.246 |
| 0.7965277777777778 | 74.246 |
| 0.7972222222222222 | 78.722 |
| 0.7979166666666666 | 83.205 |
| 0.7986111111111112 | 87.692 |
| 0.7993055555555556 | 87.692 |
| 0.7999999999999999 | 87.692 |
| 0.8006944444444444 | 83.205 |
| 0.8013888888888889 | 78.722 |
| 0.8020833333333334 | 78.722 |
| 0.8027777777777777 | 74.246 |
| 0.8034722222222223 | 74.246 |
| 0.8041666666666667 | 69.775 |
| 0.8048611111111111 | 65.31 |
| 0.8055555555555555 | 60.85 |
| 0.80625 | 56.398 |
| 0.8069444444444445 | 56.398 |
| 0.8076388888888889 | 56.398 |
| 0.8083333333333332 | 60.85 |
| 0.8090277777777778 | 60.85 |
| 0.8097222222222222 | 65.31 |
| 0.8104166666666667 | 69.775 |
| 0.811111111111111 | 74.246 |
| 0.8118055555555556 | 74.246 |
| 0.8125 | 74.246 |
| 0.8131944444444444 | 69.775 |
| 0.813888888888889 | 65.31 |
| 0.8145833333333333 | 56.398 |
| 0.8152777777777778 | 47.511 |
| 0.8159722222222222 | 43.079 |
| 0.8166666666666668 | 38.653 |
| 0.8173611111111111 | 34.234 |
| 0.8180555555555555 | 29.823 |
| 0.81875 | 29.823 |
| 0.8194444444444445 | 29.823 |
| 0.8201388888888889 | 29.823 |
| 0.8208333333333333 | 25.419 |
| 0.8215277777777777 | 25.419 |
| 0.8222222222222223 | 25.419 |
| 0.8229166666666666 | 25.419 |
| 0.8236111111111111 | 21.024 |
| 0.8243055555555556 | 21.024 |
| 0.8250000000000001 | 21.024 |
| 0.8256944444444444 | 16.636 |
| 0.8263888888888888 | 16.636 |
| 0.8270833333333334 | 16.636 |
| 0.8277777777777778 | 12.257 |
| 0.8284722222222222 | 16.636 |
| 0.8291666666666666 | 12.257 |
| 0.8298611111111112 | 12.257 |
| 0.8305555555555556 | 12.257 |
| 0.8312499999999999 | 12.257 |
| 0.8319444444444444 | 7.887 |
| 0.8326388888888889 | 7.887 |
| 0.8333333333333334 | 7.887 |
| 0.8340277777777777 | 3.525 |
| 0.8347222222222223 | 3.525 |
| 0.8354166666666667 | 3.525 |
| 0.8361111111111111 | 3.525 |
| 0.8368055555555555 | 3.525 |
| 0.8375 | 3.525 |
| 0.8381944444444445 | 0 |
| 0.8388888888888889 | 0 |
| 0.8395833333333332 | 0 |
| 0.8402777777777778 | 0 |
| 0.8409722222222222 | 0 |
| 0.8416666666666667 | 0 |
| 0.842361111111111 | 0 |
| 0.8430555555555556 | 0 |
| 0.84375 | 0 |
| 0.8444444444444444 | 0 |
| 0.845138888888889 | 0 |
| 0.8458333333333333 | 0 |
| 0.8465277777777778 | 0 |
| 0.8472222222222222 | 0 |
| 0.8479166666666668 | 0 |
| 0.8486111111111111 | 0 |
| 0.8493055555555555 | 0 |
| 0.85 | 0 |
| 0.8506944444444445 | 0 |
| 0.8513888888888889 | 0 |
| 0.8520833333333333 | 0 |
| 0.8527777777777777 | 0 |
| 0.8534722222222223 | 0 |
| 0.8541666666666666 | 0 |
| 0.8548611111111111 | 0 |
| 0.8555555555555556 | 0 |
| 0.8562500000000001 | 0 |
| 0.8569444444444444 | 0 |
| 0.8576388888888888 | 0 |
| 0.8583333333333334 | 0 |
| 0.8590277777777778 | 0 |
| 0.8597222222222222 | 0 |
| 0.8604166666666666 | 0 |
| 0.8611111111111112 | 0 |
| 0.8618055555555556 | 0 |
| 0.8624999999999999 | 0 |
| 0.8631944444444444 | 0 |
| 0.8638888888888889 | 0 |
| 0.8645833333333334 | 0 |
| 0.8652777777777777 | 0 |
| 0.8659722222222223 | 0 |
| 0.8666666666666667 | 0 |
| 0.8673611111111111 | 0 |
| 0.8680555555555555 | 0 |
| 0.86875 | 0 |
| 0.8694444444444445 | 0 |
| 0.8701388888888889 | 0 |
| 0.8708333333333332 | 0 |
| 0.8715277777777778 | 0 |
| 0.8722222222222222 | 0 |
| 0.8729166666666667 | 0 |
| 0.873611111111111 | 0 |
| 0.8743055555555556 | 0 |
| 0.875 | 0 |
| 0.8756944444444444 | 0 |
| 0.876388888888889 | 0 |
| 0.8770833333333333 | 0 |
| 0.8777777777777778 | 0 |
| 0.8784722222222222 | 0 |
| 0.8791666666666668 | 0 |
| 0.8798611111111111 | 0 |
| 0.8805555555555555 | 0 |
| 0.88125 | 0 |
| 0.8819444444444445 | 0 |
| 0.8826388888888889 | 0 |
| 0.8833333333333333 | 0 |
| 0.8840277777777777 | 0 |
| 0.8847222222222223 | 0 |
| 0.8854166666666666 | 0 |
| 0.8861111111111111 | 0 |
| 0.8868055555555556 | 0 |
| 0.8875000000000001 | 0 |
| 0.8881944444444444 | 0 |
| 0.8888888888888888 | 0 |
| 0.8895833333333334 | 0 |
| 0.8902777777777778 | 0 |
| 0.8909722222222222 | 0 |
| 0.8916666666666666 | 0 |
| 0.8923611111111112 | 0 |
| 0.8930555555555556 | 0 |
| 0.8937499999999999 | 0 |
| 0.8944444444444444 | 0 |
| 0.8951388888888889 | 0 |
| 0.8958333333333334 | 0 |
| 0.8965277777777777 | 0 |
| 0.8972222222222223 | 0 |
| 0.8979166666666667 | 0 |
| 0.8986111111111111 | 0 |
| 0.8993055555555555 | 0 |
| 0.9 | 0 |
| 0.9006944444444445 | 0 |
| 0.9013888888888889 | 0 |
| 0.9020833333333332 | 0 |
| 0.9027777777777778 | 0 |
| 0.9034722222222222 | 0 |
| 0.9041666666666667 | 0 |
| 0.904861111111111 | 0 |
| 0.9055555555555556 | 0 |
| 0.90625 | 0 |
| 0.9069444444444444 | 0 |
| 0.907638888888889 | 0 |
| 0.9083333333333333 | 0 |
| 0.9090277777777778 | 0 |
| 0.9097222222222222 | 0 |
| 0.9104166666666668 | 0 |
| 0.9111111111111111 | 0 |
| 0.9118055555555555 | 0 |
| 0.9125 | 0 |
| 0.9131944444444445 | 0 |
| 0.9138888888888889 | 0 |
| 0.9145833333333333 | 0 |
| 0.9152777777777777 | 0 |
| 0.9159722222222223 | 0 |
| 0.9166666666666666 | 0 |
| 0.9173611111111111 | 0 |
| 0.9180555555555556 | 0 |
| 0.9187500000000001 | 0 |
| 0.9194444444444444 | 0 |
| 0.9201388888888888 | 0 |
| 0.9208333333333334 | 0 |
| 0.9215277777777778 | 0 |
| 0.9222222222222222 | 0 |
| 0.9229166666666666 | 0 |
| 0.9236111111111112 | 0 |
| 0.9243055555555556 | 0 |
| 0.9249999999999999 | 0 |
| 0.9256944444444444 | 0 |
| 0.9263888888888889 | 0 |
| 0.9270833333333334 | 0 |
| 0.9277777777777777 | 0 |
| 0.9284722222222223 | 0 |
| 0.9291666666666667 | 0 |
| 0.9298611111111111 | 0 |
| 0.9305555555555555 | 0 |
| 0.93125 | 0 |
| 0.9319444444444445 | 0 |
| 0.9326388888888889 | 0 |
| 0.9333333333333332 | 0 |
| 0.9340277777777778 | 0 |
| 0.9347222222222222 | 0 |
| 0.9354166666666667 | 0 |
| 0.936111111111111 | 0 |
| 0.9368055555555556 | 0 |
| 0.9375 | 0 |
| 0.9381944444444444 | 0 |
| 0.938888888888889 | 0 |
| 0.9395833333333333 | 0 |
| 0.9402777777777778 | 0 |
| 0.9409722222222222 | 0 |
| 0.9416666666666668 | 0 |
| 0.9423611111111111 | 0 |
| 0.9430555555555555 | 0 |
| 0.94375 | 0 |
| 0.9444444444444445 | 0 |
| 0.9451388888888889 | 0 |
| 0.9458333333333333 | 0 |
| 0.9465277777777777 | 0 |
| 0.9472222222222223 | 0 |
| 0.9479166666666666 | 0 |
| 0.9486111111111111 | 0 |
| 0.9493055555555556 | 0 |
| 0.9500000000000001 | 0 |
| 0.9506944444444444 | 0 |
| 0.9513888888888888 | 0 |
| 0.9520833333333334 | 0 |
| 0.9527777777777778 | 0 |
| 0.9534722222222222 | 0 |
| 0.9541666666666666 | 0 |
| 0.9548611111111112 | 0 |
| 0.9555555555555556 | 0 |
| 0.9562499999999999 | 0 |
| 0.9569444444444444 | 0 |
| 0.9576388888888889 | 0 |
| 0.9583333333333334 | 0 |
| 0.9590277777777777 | 0 |
| 0.9597222222222223 | 0 |
| 0.9604166666666667 | 0 |
| 0.9611111111111111 | 0 |
| 0.9618055555555555 | 0 |
| 0.9625 | 0 |
| 0.9631944444444445 | 0 |
| 0.9638888888888889 | 0 |
| 0.9645833333333332 | 0 |
| 0.9652777777777778 | 0 |
| 0.9659722222222222 | 0 |
| 0.9666666666666667 | 0 |
| 0.967361111111111 | 0 |
| 0.9680555555555556 | 0 |
| 0.96875 | 0 |
| 0.9694444444444444 | 0 |
| 0.970138888888889 | 0 |
| 0.9708333333333333 | 0 |
| 0.9715277777777778 | 0 |
| 0.9722222222222222 | 0 |
| 0.9729166666666668 | 0 |
| 0.9736111111111111 | 0 |
| 0.9743055555555555 | 0 |
| 0.975 | 0 |
| 0.9756944444444445 | 0 |
| 0.9763888888888889 | 0 |
| 0.9770833333333333 | 0 |
| 0.9777777777777777 | 0 |
| 0.9784722222222223 | 0 |
| 0.9791666666666666 | 0 |
| 0.9798611111111111 | 0 |
| 0.9805555555555556 | 0 |
| 0.9812500000000001 | 0 |
| 0.9819444444444444 | 0 |
| 0.9826388888888888 | 0 |
| 0.9833333333333334 | 0 |
| 0.9840277777777778 | 0 |
| 0.9847222222222222 | 0 |
| 0.9854166666666666 | 0 |
| 0.9861111111111112 | 0 |
| 0.9868055555555556 | 0 |
| 0.9874999999999999 | 0 |
| 0.9881944444444444 | 0 |
| 0.9888888888888889 | 0 |
| 0.9895833333333334 | 0 |
| 0.9902777777777777 | 0 |
| 0.9909722222222223 | 0 |
| 0.9916666666666667 | 0 |
| 0.9923611111111111 | 0 |
| 0.9930555555555555 | 0 |
| 0.99375 | 0 |
| 0.9944444444444445 | 0 |
| 0.9951388888888889 | 0 |
| 0.9958333333333332 | 0 |
| 0.9965277777777778 | 0 |
| 0.9972222222222222 | 0 |
| 0.9979166666666667 | 0 |
| 0.998611111111111 | 0 |
| 0.9993055555555556 | 0 |